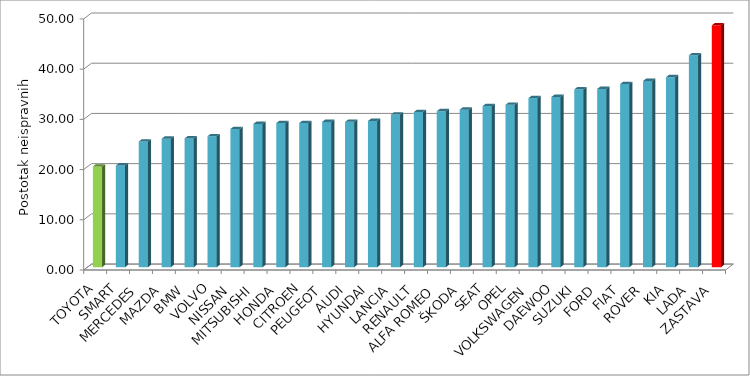
| Category | Series 4 |
|---|---|
| TOYOTA | 20.05 |
| SMART | 20.258 |
| MERCEDES | 25.03 |
| MAZDA | 25.593 |
| BMW | 25.648 |
| VOLVO | 26.069 |
| NISSAN | 27.517 |
| MITSUBISHI | 28.531 |
| HONDA | 28.696 |
| CITROEN | 28.701 |
| PEUGEOT | 28.935 |
| AUDI | 28.943 |
| HYUNDAI | 29.116 |
| LANCIA | 30.402 |
| RENAULT | 30.885 |
| ALFA ROMEO | 31.062 |
| ŠKODA | 31.377 |
| SEAT | 32.078 |
| OPEL | 32.343 |
| VOLKSWAGEN | 33.677 |
| DAEWOO | 33.894 |
| SUZUKI | 35.417 |
| FORD | 35.498 |
| FIAT | 36.463 |
| ROVER | 37.088 |
| KIA | 37.837 |
| LADA | 42.198 |
| ZASTAVA | 48.171 |